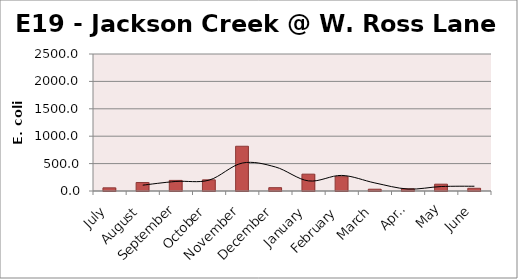
| Category | E. coli MPN |
|---|---|
| July | 57.6 |
| August | 155.3 |
| September | 193.5 |
| October | 203.5 |
| November | 816.4 |
| December | 60.5 |
| January | 307.6 |
| February | 261.3 |
| March | 32.7 |
| April | 38.8 |
| May | 124.6 |
| June | 49.6 |